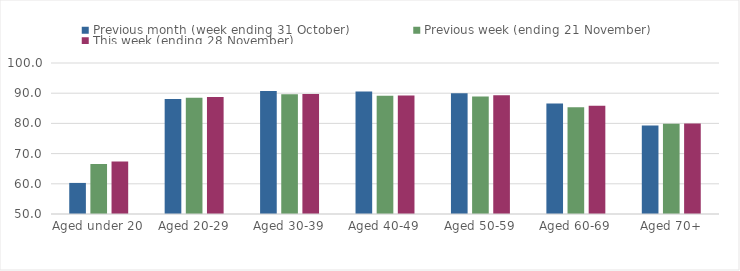
| Category | Previous month (week ending 31 October) | Previous week (ending 21 November) | This week (ending 28 November) |
|---|---|---|---|
| Aged under 20 | 60.29 | 66.55 | 67.39 |
| Aged 20-29 | 88.1 | 88.48 | 88.75 |
| Aged 30-39 | 90.7 | 89.63 | 89.7 |
| Aged 40-49 | 90.54 | 89.12 | 89.22 |
| Aged 50-59 | 90.01 | 88.87 | 89.36 |
| Aged 60-69 | 86.59 | 85.38 | 85.85 |
| Aged 70+ | 79.29 | 79.88 | 79.93 |